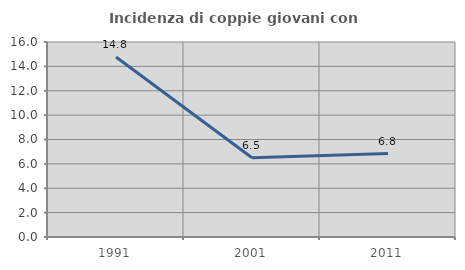
| Category | Incidenza di coppie giovani con figli |
|---|---|
| 1991.0 | 14.765 |
| 2001.0 | 6.509 |
| 2011.0 | 6.845 |